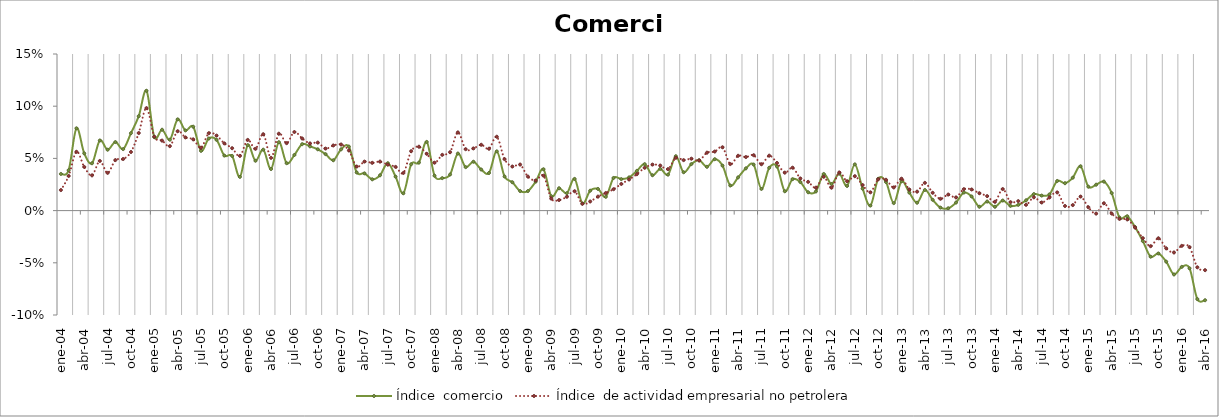
| Category | Índice  comercio | Índice  de actividad empresarial no petrolera |
|---|---|---|
| 2004-01-01 | 0.035 | 0.02 |
| 2004-02-01 | 0.039 | 0.033 |
| 2004-03-01 | 0.079 | 0.056 |
| 2004-04-01 | 0.055 | 0.042 |
| 2004-05-01 | 0.045 | 0.034 |
| 2004-06-01 | 0.067 | 0.048 |
| 2004-07-01 | 0.058 | 0.036 |
| 2004-08-01 | 0.066 | 0.048 |
| 2004-09-01 | 0.059 | 0.049 |
| 2004-10-01 | 0.074 | 0.056 |
| 2004-11-01 | 0.09 | 0.074 |
| 2004-12-01 | 0.115 | 0.098 |
| 2005-01-01 | 0.07 | 0.071 |
| 2005-02-01 | 0.077 | 0.067 |
| 2005-03-01 | 0.068 | 0.062 |
| 2005-04-01 | 0.087 | 0.076 |
| 2005-05-01 | 0.077 | 0.07 |
| 2005-06-01 | 0.08 | 0.068 |
| 2005-07-01 | 0.057 | 0.06 |
| 2005-08-01 | 0.069 | 0.074 |
| 2005-09-01 | 0.068 | 0.072 |
| 2005-10-01 | 0.053 | 0.064 |
| 2005-11-01 | 0.052 | 0.06 |
| 2005-12-01 | 0.032 | 0.052 |
| 2006-01-01 | 0.063 | 0.068 |
| 2006-02-01 | 0.048 | 0.059 |
| 2006-03-01 | 0.058 | 0.073 |
| 2006-04-01 | 0.04 | 0.051 |
| 2006-05-01 | 0.066 | 0.074 |
| 2006-06-01 | 0.045 | 0.065 |
| 2006-07-01 | 0.053 | 0.075 |
| 2006-08-01 | 0.064 | 0.069 |
| 2006-09-01 | 0.062 | 0.064 |
| 2006-10-01 | 0.059 | 0.065 |
| 2006-11-01 | 0.054 | 0.059 |
| 2006-12-01 | 0.048 | 0.062 |
| 2007-01-01 | 0.059 | 0.063 |
| 2007-02-01 | 0.061 | 0.058 |
| 2007-03-01 | 0.037 | 0.042 |
| 2007-04-01 | 0.036 | 0.047 |
| 2007-05-01 | 0.03 | 0.046 |
| 2007-06-01 | 0.034 | 0.047 |
| 2007-07-01 | 0.045 | 0.044 |
| 2007-08-01 | 0.033 | 0.042 |
| 2007-09-01 | 0.017 | 0.036 |
| 2007-10-01 | 0.044 | 0.057 |
| 2007-11-01 | 0.046 | 0.061 |
| 2007-12-01 | 0.066 | 0.054 |
| 2008-01-01 | 0.033 | 0.046 |
| 2008-02-01 | 0.031 | 0.053 |
| 2008-03-01 | 0.035 | 0.056 |
| 2008-04-01 | 0.055 | 0.075 |
| 2008-05-01 | 0.042 | 0.059 |
| 2008-06-01 | 0.047 | 0.06 |
| 2008-07-01 | 0.039 | 0.063 |
| 2008-08-01 | 0.036 | 0.059 |
| 2008-09-01 | 0.057 | 0.071 |
| 2008-10-01 | 0.033 | 0.049 |
| 2008-11-01 | 0.027 | 0.042 |
| 2008-12-01 | 0.019 | 0.044 |
| 2009-01-01 | 0.019 | 0.033 |
| 2009-02-01 | 0.028 | 0.029 |
| 2009-03-01 | 0.04 | 0.033 |
| 2009-04-01 | 0.014 | 0.012 |
| 2009-05-01 | 0.021 | 0.01 |
| 2009-06-01 | 0.017 | 0.013 |
| 2009-07-01 | 0.03 | 0.019 |
| 2009-08-01 | 0.007 | 0.006 |
| 2009-09-01 | 0.019 | 0.009 |
| 2009-10-01 | 0.021 | 0.013 |
| 2009-11-01 | 0.013 | 0.017 |
| 2009-12-01 | 0.031 | 0.02 |
| 2010-01-01 | 0.03 | 0.026 |
| 2010-02-01 | 0.032 | 0.03 |
| 2010-03-01 | 0.038 | 0.035 |
| 2010-04-01 | 0.045 | 0.041 |
| 2010-05-01 | 0.034 | 0.044 |
| 2010-06-01 | 0.04 | 0.043 |
| 2010-07-01 | 0.034 | 0.04 |
| 2010-08-01 | 0.052 | 0.051 |
| 2010-09-01 | 0.037 | 0.048 |
| 2010-10-01 | 0.045 | 0.05 |
| 2010-11-01 | 0.048 | 0.048 |
| 2010-12-01 | 0.042 | 0.055 |
| 2011-01-01 | 0.049 | 0.057 |
| 2011-02-01 | 0.043 | 0.061 |
| 2011-03-01 | 0.024 | 0.045 |
| 2011-04-01 | 0.032 | 0.053 |
| 2011-05-01 | 0.04 | 0.051 |
| 2011-06-01 | 0.044 | 0.053 |
| 2011-07-01 | 0.021 | 0.044 |
| 2011-08-01 | 0.041 | 0.053 |
| 2011-09-01 | 0.042 | 0.046 |
| 2011-10-01 | 0.019 | 0.036 |
| 2011-11-01 | 0.03 | 0.041 |
| 2011-12-01 | 0.027 | 0.031 |
| 2012-01-01 | 0.018 | 0.028 |
| 2012-02-01 | 0.018 | 0.022 |
| 2012-03-01 | 0.035 | 0.032 |
| 2012-04-01 | 0.025 | 0.022 |
| 2012-05-01 | 0.035 | 0.037 |
| 2012-06-01 | 0.024 | 0.028 |
| 2012-07-01 | 0.044 | 0.033 |
| 2012-08-01 | 0.021 | 0.024 |
| 2012-09-01 | 0.005 | 0.018 |
| 2012-10-01 | 0.03 | 0.03 |
| 2012-11-01 | 0.027 | 0.03 |
| 2012-12-01 | 0.007 | 0.022 |
| 2013-01-01 | 0.028 | 0.031 |
| 2013-02-01 | 0.017 | 0.02 |
| 2013-03-01 | 0.008 | 0.018 |
| 2013-04-01 | 0.02 | 0.027 |
| 2013-05-01 | 0.01 | 0.017 |
| 2013-06-01 | 0.003 | 0.011 |
| 2013-07-01 | 0.002 | 0.015 |
| 2013-08-01 | 0.008 | 0.013 |
| 2013-09-01 | 0.017 | 0.021 |
| 2013-10-01 | 0.014 | 0.02 |
| 2013-11-01 | 0.004 | 0.017 |
| 2013-12-01 | 0.009 | 0.014 |
| 2014-01-01 | 0.004 | 0.008 |
| 2014-02-01 | 0.01 | 0.021 |
| 2014-03-01 | 0.004 | 0.008 |
| 2014-04-01 | 0.005 | 0.009 |
| 2014-05-01 | 0.01 | 0.006 |
| 2014-06-01 | 0.016 | 0.013 |
| 2014-07-01 | 0.014 | 0.008 |
| 2014-08-01 | 0.016 | 0.013 |
| 2014-09-01 | 0.028 | 0.017 |
| 2014-10-01 | 0.026 | 0.004 |
| 2014-11-01 | 0.032 | 0.005 |
| 2014-12-01 | 0.042 | 0.013 |
| 2015-01-01 | 0.023 | 0.003 |
| 2015-02-01 | 0.025 | -0.003 |
| 2015-03-01 | 0.028 | 0.007 |
| 2015-04-01 | 0.017 | -0.003 |
| 2015-05-01 | -0.007 | -0.008 |
| 2015-06-01 | -0.005 | -0.008 |
| 2015-07-01 | -0.016 | -0.016 |
| 2015-08-01 | -0.029 | -0.026 |
| 2015-09-01 | -0.044 | -0.034 |
| 2015-10-01 | -0.041 | -0.027 |
| 2015-11-01 | -0.049 | -0.036 |
| 2015-12-01 | -0.061 | -0.04 |
| 2016-01-01 | -0.054 | -0.034 |
| 2016-02-01 | -0.055 | -0.035 |
| 2016-03-01 | -0.085 | -0.054 |
| 2016-04-01 | -0.086 | -0.057 |